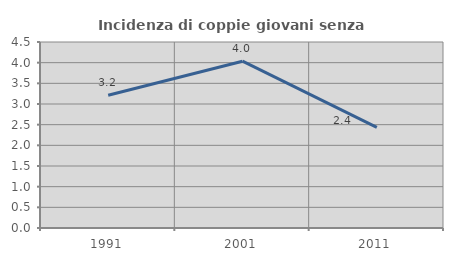
| Category | Incidenza di coppie giovani senza figli |
|---|---|
| 1991.0 | 3.211 |
| 2001.0 | 4.036 |
| 2011.0 | 2.434 |